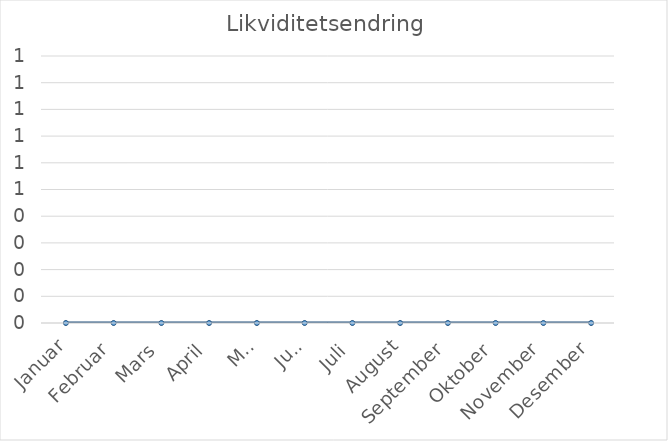
| Category | Likviditetsendring |
|---|---|
| Januar | 0 |
| Februar | 0 |
| Mars | 0 |
| April | 0 |
| Mai | 0 |
| Juni | 0 |
| Juli | 0 |
| August | 0 |
| September | 0 |
| Oktober | 0 |
| November | 0 |
| Desember | 0 |